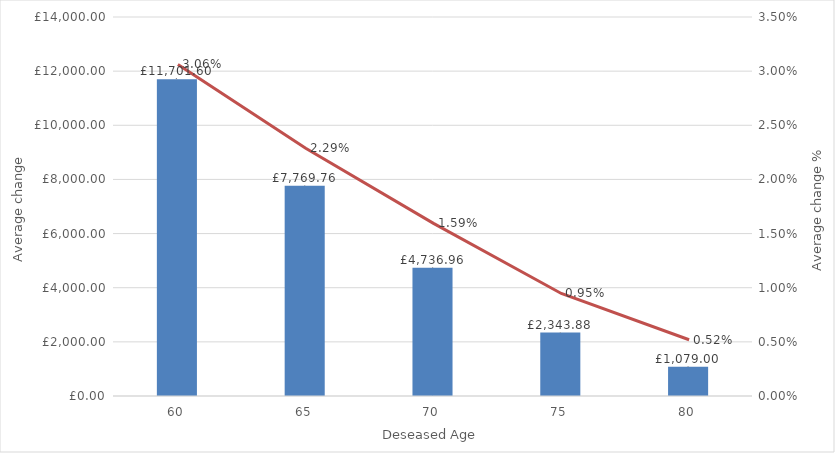
| Category | Value change |
|---|---|
| 60.0 | 11701.595 |
| 65.0 | 7769.76 |
| 70.0 | 4736.955 |
| 75.0 | 2343.88 |
| 80.0 | 1079 |